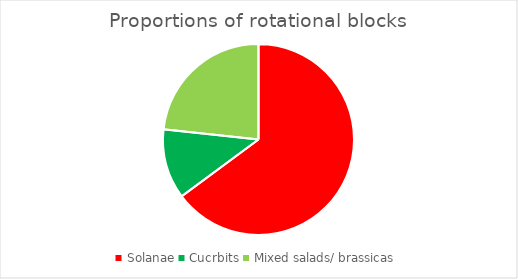
| Category | Series 0 |
|---|---|
| Solanae | 210.537 |
| Cucrbits | 38.4 |
| Mixed salads/ brassicas | 75.636 |